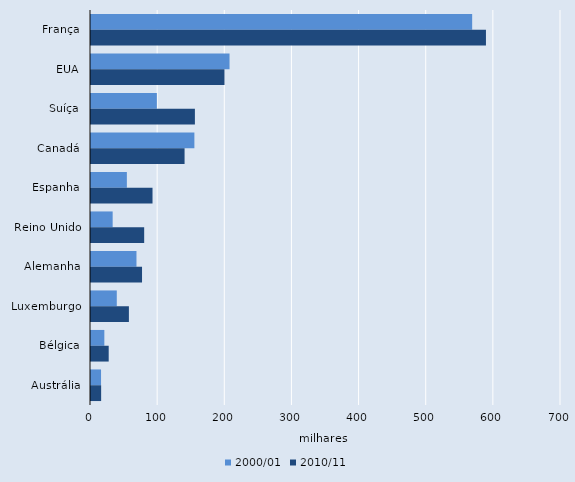
| Category | 2000/01 | 2010/11 |
|---|---|---|
| França | 567.7 | 588.223 |
| EUA | 206.34 | 198.846 |
| Suíça | 98.103 | 154.752 |
| Canadá | 153.985 | 139.365 |
| Espanha | 53.42 | 91.62 |
| Reino Unido | 32.263 | 79.199 |
| Alemanha | 67.72 | 76 |
| Luxemburgo | 38.398 | 56.45 |
| Bélgica | 19.87 | 26.358 |
| Austrália | 14.959 | 15.104 |